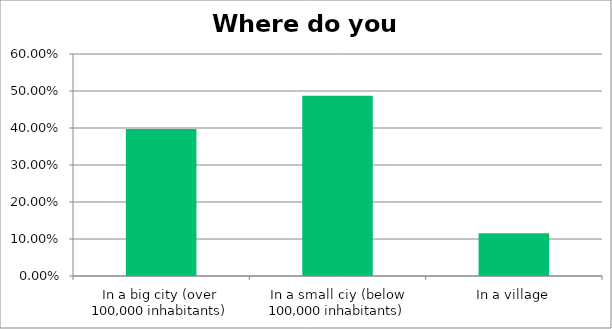
| Category | Responses |
|---|---|
| In a big city (over 100,000 inhabitants) | 0.397 |
| In a small ciy (below 100,000 inhabitants) | 0.487 |
| In a village | 0.115 |